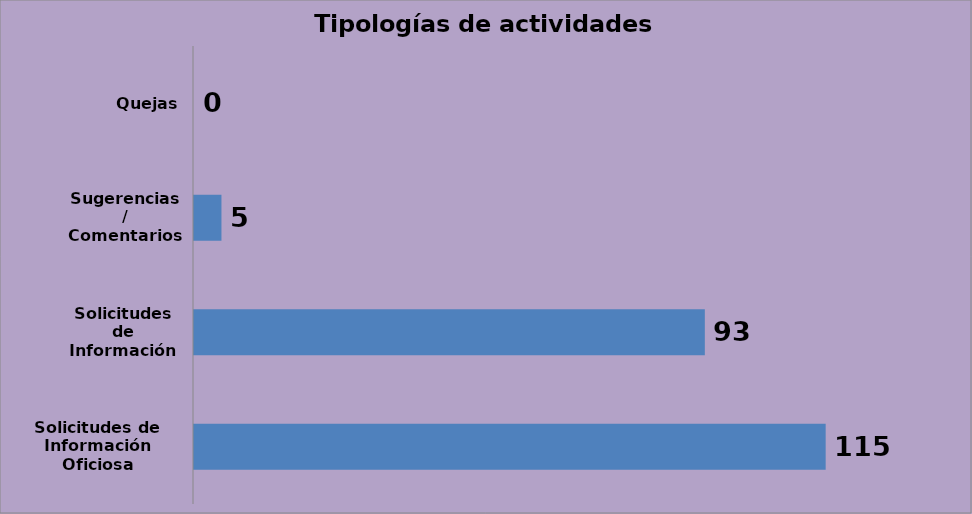
| Category | Series 0 |
|---|---|
| Solicitudes de Información Oficiosa | 115 |
| Solicitudes de Información Especifica | 93 |
| Sugerencias / Comentarios | 5 |
| Quejas  | 0 |